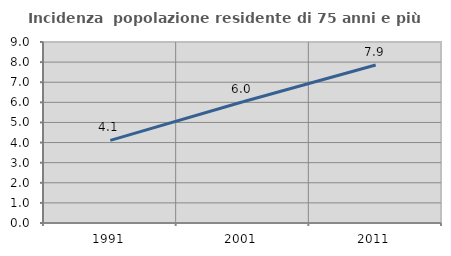
| Category | Incidenza  popolazione residente di 75 anni e più |
|---|---|
| 1991.0 | 4.108 |
| 2001.0 | 6.032 |
| 2011.0 | 7.855 |